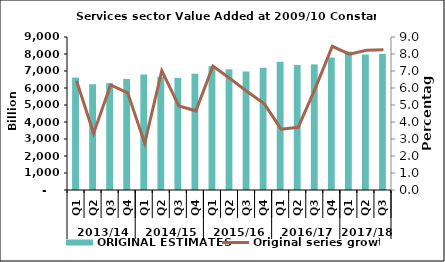
| Category | ORIGINAL ESTIMATES |
|---|---|
| 0 | 6612.793 |
| 1 | 6222.74 |
| 2 | 6281.1 |
| 3 | 6536.151 |
| 4 | 6794.173 |
| 5 | 6659.591 |
| 6 | 6591.37 |
| 7 | 6840.595 |
| 8 | 7289.572 |
| 9 | 7096.232 |
| 10 | 6973.399 |
| 11 | 7188.045 |
| 12 | 7550.545 |
| 13 | 7358.133 |
| 14 | 7390.068 |
| 15 | 7795.69 |
| 16 | 8153.792 |
| 17 | 7963.284 |
| 18 | 7999.696 |